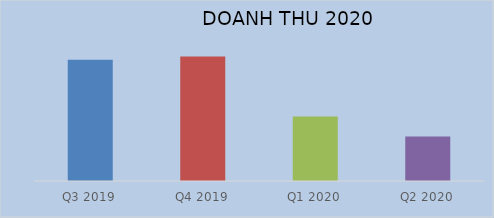
| Category | Series 0 |
|---|---|
| Q3 2019 | 13577576074250 |
| Q4 2019 | 13925759710091 |
| Q1 2020 | 7230230374771 |
| Q2 2020 | 4969817152005 |